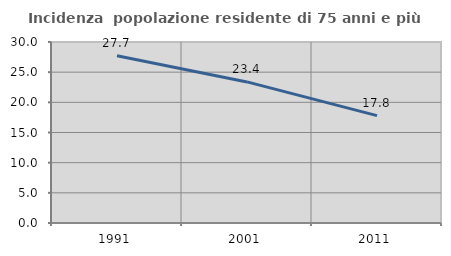
| Category | Incidenza  popolazione residente di 75 anni e più |
|---|---|
| 1991.0 | 27.733 |
| 2001.0 | 23.385 |
| 2011.0 | 17.793 |